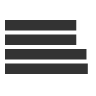
| Category | Series 0 |
|---|---|
| 0 | 408.6 |
| 1 | 408.6 |
| 2 | 467.845 |
| 3 | 475.604 |